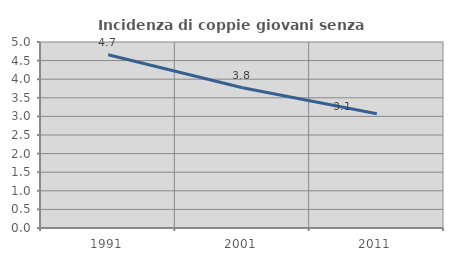
| Category | Incidenza di coppie giovani senza figli |
|---|---|
| 1991.0 | 4.656 |
| 2001.0 | 3.771 |
| 2011.0 | 3.07 |